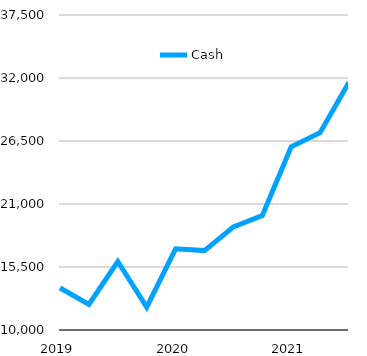
| Category | Cash |
|---|---|
| 2019 | 13682 |
|  | 12226 |
|  | 15978 |
|  | 12000 |
| 2020 | 17082 |
|  | 16930 |
|  | 19000 |
|  | 20000 |
| 2021 | 26000 |
|  | 27231 |
|  | 31628 |